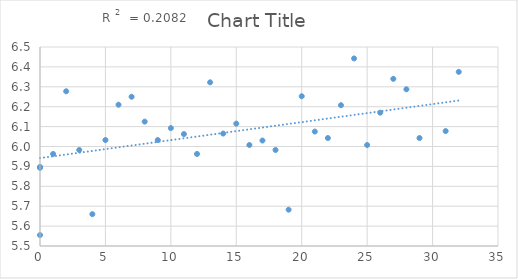
| Category | Series 0 |
|---|---|
| 24.0 | 6.442 |
| 13.0 | 6.322 |
| 7.0 | 6.25 |
| 14.0 | 6.065 |
| 21.0 | 6.075 |
| 11.0 | 6.062 |
| 4.0 | 5.66 |
| 27.0 | 6.34 |
| 18.0 | 5.982 |
| 23.0 | 6.208 |
| 22.0 | 6.042 |
| 26.0 | 6.17 |
| 1.0 | 5.962 |
| 29.0 | 6.042 |
| 32.0 | 6.375 |
| 6.0 | 6.21 |
| 20.0 | 6.252 |
| 10.0 | 6.092 |
| 2.0 | 6.278 |
| 28.0 | 6.288 |
| 5.0 | 6.032 |
| 3.0 | 5.982 |
| 9.0 | 6.033 |
| 25.0 | 6.007 |
| 8.0 | 6.125 |
| 19.0 | 5.682 |
| 16.0 | 6.008 |
| 31.0 | 6.078 |
| 15.0 | 6.115 |
| 12.0 | 5.962 |
| 17.0 | 6.03 |